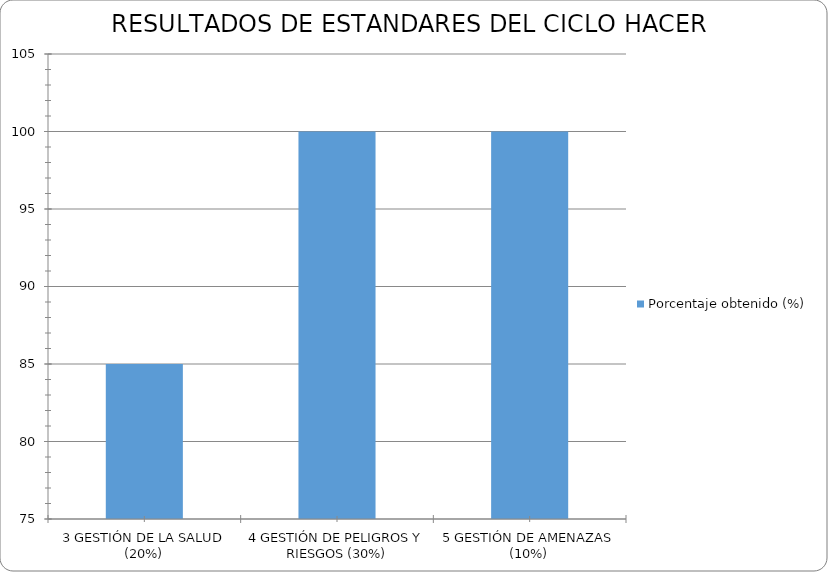
| Category | Porcentaje obtenido (%) |
|---|---|
| 3 GESTIÓN DE LA SALUD (20%) | 85 |
| 4 GESTIÓN DE PELIGROS Y RIESGOS (30%) | 100 |
| 5 GESTIÓN DE AMENAZAS (10%) | 100 |